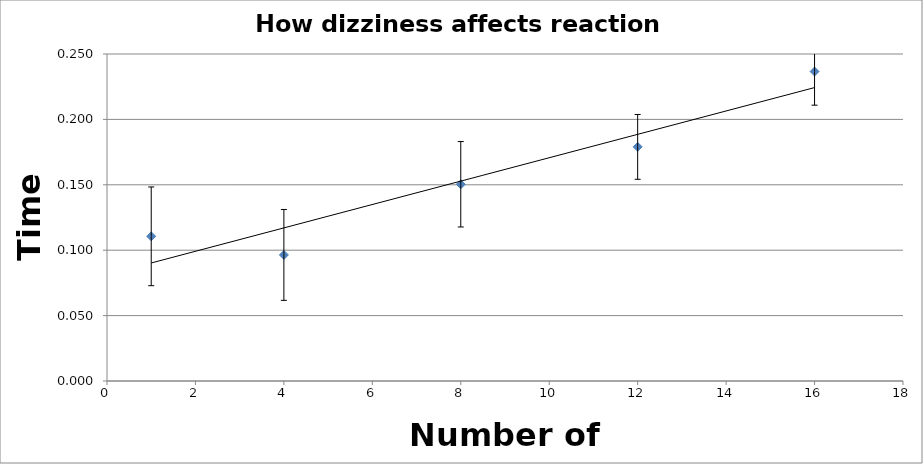
| Category | Series 0 |
|---|---|
| 1.0 | 0.111 |
| 4.0 | 0.096 |
| 8.0 | 0.15 |
| 12.0 | 0.179 |
| 16.0 | 0.237 |